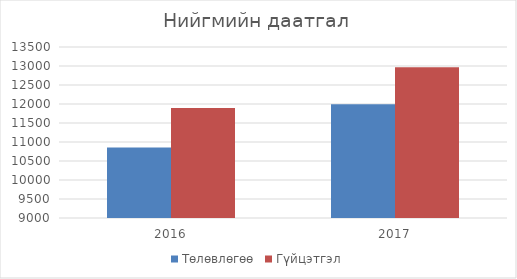
| Category | Төлөвлөгөө | Гүйцэтгэл |
|---|---|---|
| 2016.0 | 10853 | 11893 |
| 2017.0 | 11992 | 12968 |